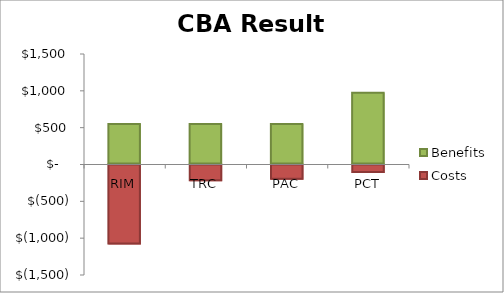
| Category | Costs | Benefits |
|---|---|---|
| RIM | -1086.022 | 550.751 |
| TRC | -228.668 | 550.751 |
| PAC | -208.135 | 550.751 |
| PCT | -116.865 | 974.218 |